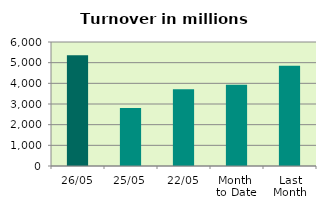
| Category | Series 0 |
|---|---|
| 26/05 | 5360.456 |
| 25/05 | 2801.043 |
| 22/05 | 3719.715 |
| Month 
to Date | 3936.99 |
| Last
Month | 4850.364 |